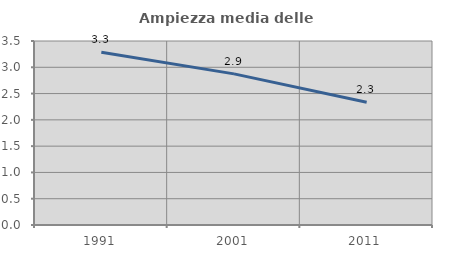
| Category | Ampiezza media delle famiglie |
|---|---|
| 1991.0 | 3.285 |
| 2001.0 | 2.875 |
| 2011.0 | 2.336 |